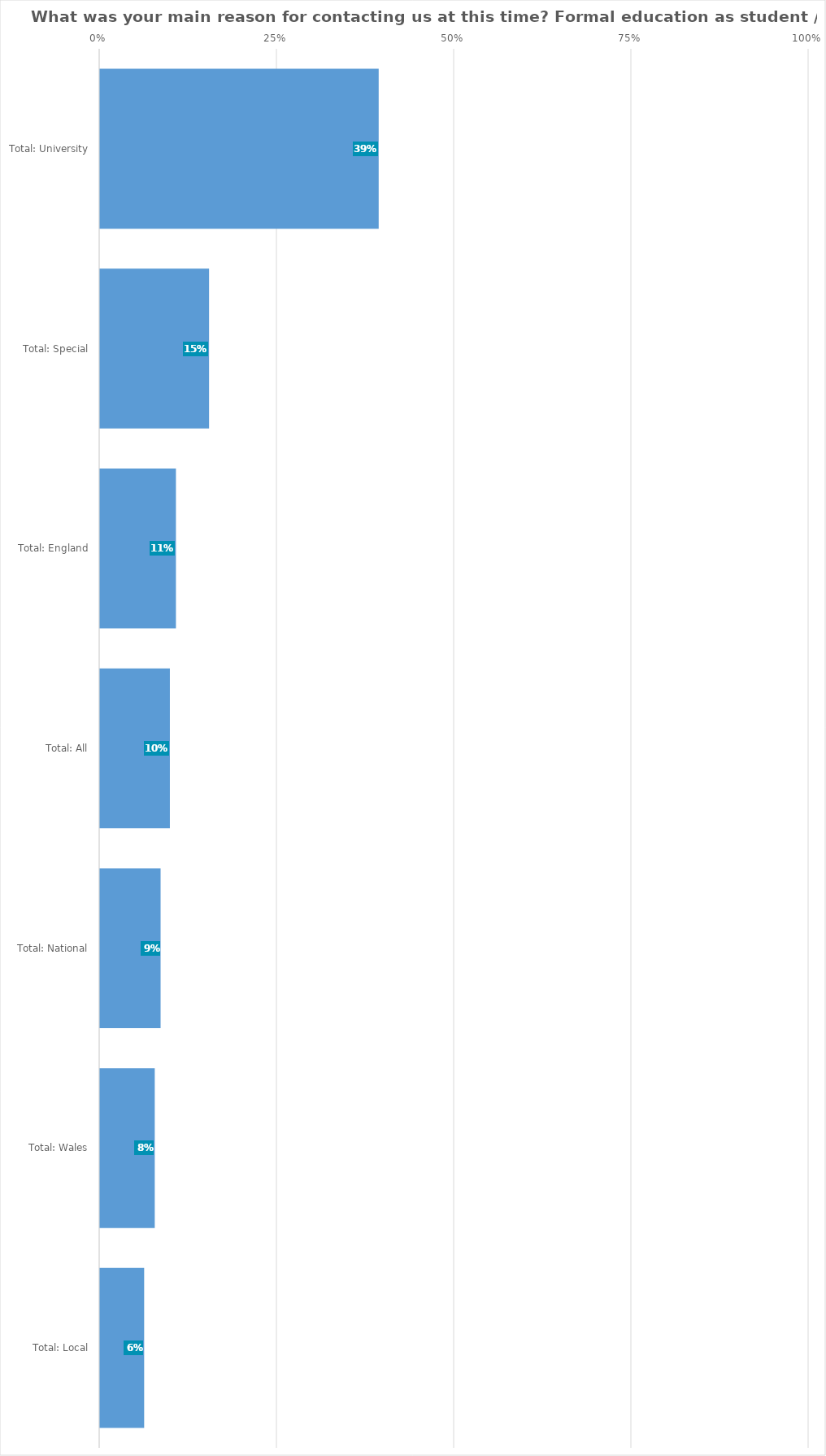
| Category | Formal education as student / researcher |
|---|---|
| Total: University | 0.393 |
| Total: Special | 0.154 |
| Total: England | 0.107 |
| Total: All | 0.099 |
| Total: National | 0.085 |
| Total: Wales | 0.077 |
| Total: Local | 0.062 |